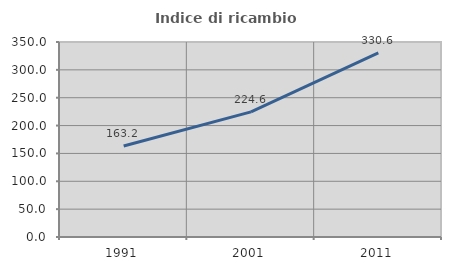
| Category | Indice di ricambio occupazionale  |
|---|---|
| 1991.0 | 163.242 |
| 2001.0 | 224.605 |
| 2011.0 | 330.644 |